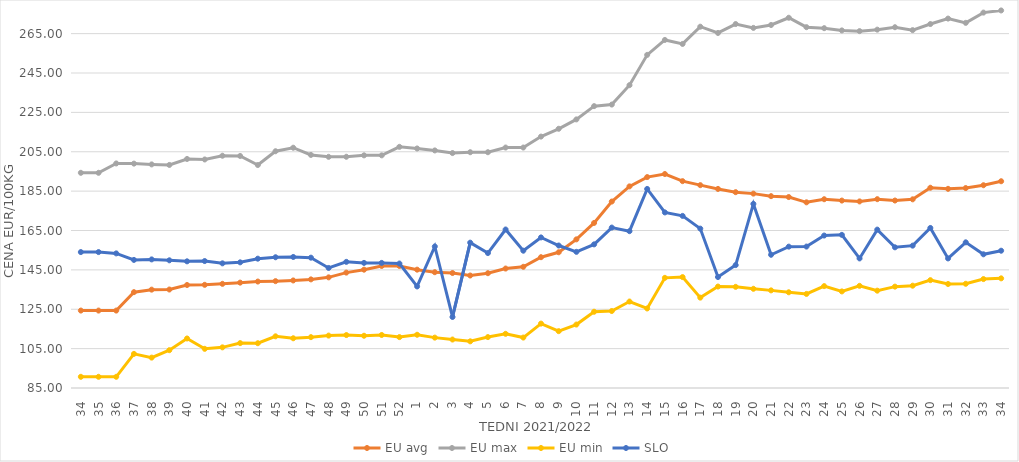
| Category | EU avg | EU max | EU min | SLO |
|---|---|---|---|---|
| 34.0 | 124.332 | 194.304 | 90.69 | 154.04 |
| 35.0 | 124.332 | 194.304 | 90.69 | 154.04 |
| 36.0 | 124.332 | 199.06 | 90.69 | 153.37 |
| 37.0 | 133.685 | 198.97 | 102.334 | 150.06 |
| 38.0 | 134.959 | 198.57 | 100.43 | 150.32 |
| 39.0 | 135.021 | 198.3 | 104.21 | 149.86 |
| 40.0 | 137.315 | 201.34 | 110.15 | 149.34 |
| 41.0 | 137.411 | 201.081 | 104.9 | 149.48 |
| 42.0 | 137.908 | 202.98 | 105.65 | 148.32 |
| 43.0 | 138.52 | 202.856 | 107.8 | 148.83 |
| 44.0 | 139.076 | 198.26 | 107.75 | 150.69 |
| 45.0 | 139.275 | 205.257 | 111.25 | 151.41 |
| 46.0 | 139.626 | 207.046 | 110.26 | 151.56 |
| 47.0 | 140.17 | 203.387 | 110.83 | 151.2 |
| 48.0 | 141.2 | 202.42 | 111.62 | 145.97 |
| 49.0 | 143.614 | 202.45 | 111.89 | 149.07 |
| 50.0 | 145.101 | 203.17 | 111.54 | 148.55 |
| 51.0 | 146.984 | 203.17 | 111.93 | 148.54 |
| 52.0 | 146.958 | 207.5 | 110.85 | 148.22 |
| 1.0 | 145.11 | 206.66 | 112.04 | 136.59 |
| 2.0 | 143.822 | 205.67 | 110.59 | 156.88 |
| 3.0 | 143.402 | 204.34 | 109.62 | 121.07 |
| 4.0 | 142.134 | 204.76 | 108.71 | 158.82 |
| 5.0 | 143.314 | 204.76 | 110.86 | 153.55 |
| 6.0 | 145.677 | 207.14 | 112.52 | 165.51 |
| 7.0 | 146.556 | 207.14 | 110.619 | 154.74 |
| 8.0 | 151.439 | 212.7 | 117.709 | 161.48 |
| 9.0 | 153.947 | 216.67 | 113.871 | 157.38 |
| 10.0 | 160.496 | 221.43 | 117.233 | 154.16 |
| 11.0 | 168.845 | 228.17 | 123.737 | 157.96 |
| 12.0 | 179.714 | 228.97 | 124.105 | 166.49 |
| 13.0 | 187.409 | 238.81 | 128.918 | 164.66 |
| 14.0 | 192.137 | 254.21 | 125.399 | 186.11 |
| 15.0 | 193.697 | 261.79 | 140.954 | 174.18 |
| 16.0 | 190.066 | 259.76 | 141.337 | 172.42 |
| 17.0 | 188.031 | 268.52 | 130.897 | 165.96 |
| 18.0 | 186.119 | 265.34 | 136.529 | 141.36 |
| 19.0 | 184.47 | 269.87 | 136.387 | 147.43 |
| 20.0 | 183.734 | 267.92 | 135.392 | 178.51 |
| 21.0 | 182.45 | 269.38 | 134.589 | 152.67 |
| 22.0 | 181.991 | 273.06 | 133.621 | 156.8 |
| 23.0 | 179.308 | 268.27 | 132.787 | 156.84 |
| 24.0 | 180.886 | 267.77 | 136.75 | 162.44 |
| 25.0 | 180.2 | 266.63 | 134.058 | 162.78 |
| 26.0 | 179.77 | 266.27 | 136.895 | 150.82 |
| 27.0 | 180.913 | 267.02 | 134.44 | 165.45 |
| 28.0 | 180.226 | 268.25 | 136.486 | 156.46 |
| 29.0 | 180.834 | 266.77 | 136.97 | 157.31 |
| 30.0 | 186.714 | 269.87 | 139.777 | 166.29 |
| 31.0 | 186.163 | 272.64 | 137.828 | 150.81 |
| 32.0 | 186.553 | 270.47 | 137.934 | 158.99 |
| 33.0 | 187.993 | 275.68 | 140.33 | 152.91 |
| 34.0 | 190.024 | 276.77 | 140.7 | 154.73 |